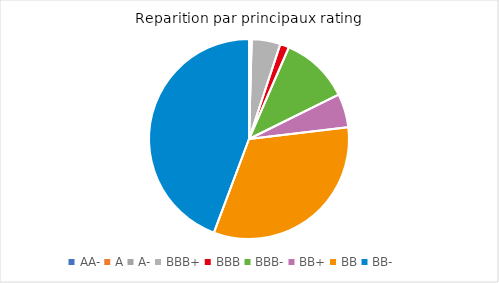
| Category | Encours € |
|---|---|
| AA- | 1431377 |
| A | 2000000 |
| A- | 340000 |
| BBB+ | 40261000 |
| BBB | 12626039 |
| BBB- | 96739250 |
| BB+ | 47194200 |
| BB | 282973093 |
| BB- | 384434844 |